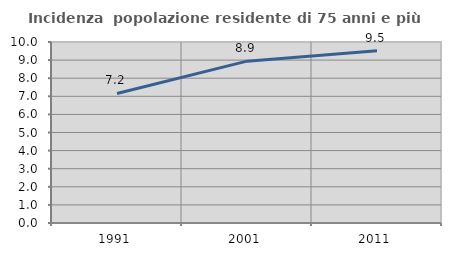
| Category | Incidenza  popolazione residente di 75 anni e più |
|---|---|
| 1991.0 | 7.158 |
| 2001.0 | 8.941 |
| 2011.0 | 9.512 |